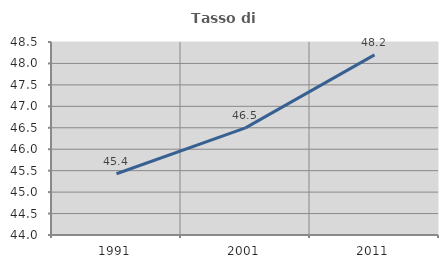
| Category | Tasso di occupazione   |
|---|---|
| 1991.0 | 45.429 |
| 2001.0 | 46.499 |
| 2011.0 | 48.199 |